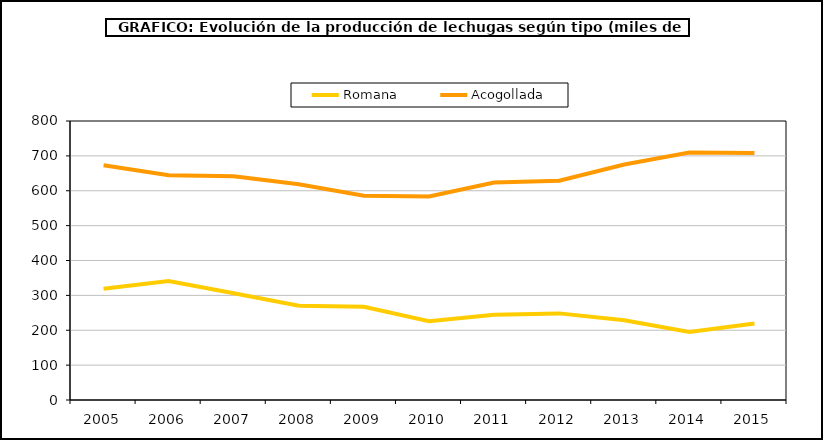
| Category | Romana | Acogollada |
|---|---|---|
| 2005.0 | 318.774 | 673.099 |
| 2006.0 | 341.254 | 644.607 |
| 2007.0 | 306.019 | 641.593 |
| 2008.0 | 270.572 | 618.661 |
| 2009.0 | 267.562 | 585.426 |
| 2010.0 | 225.829 | 583.561 |
| 2011.0 | 244.577 | 623.859 |
| 2012.0 | 248.374 | 628.552 |
| 2013.0 | 228.928 | 675.355 |
| 2014.0 | 195.068 | 709.734 |
| 2015.0 | 219.245 | 708.133 |